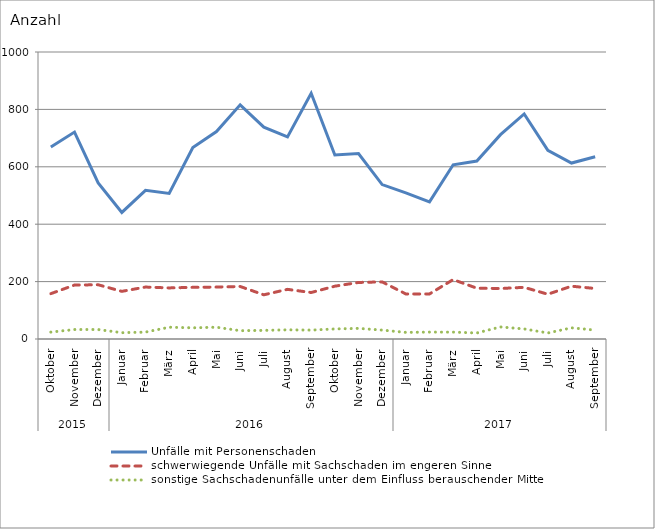
| Category | Unfälle mit Personenschaden | schwerwiegende Unfälle mit Sachschaden im engeren Sinne | sonstige Sachschadenunfälle unter dem Einfluss berauschender Mittel |
|---|---|---|---|
| 0 | 669 | 158 | 24 |
| 1 | 721 | 188 | 33 |
| 2 | 544 | 189 | 33 |
| 3 | 441 | 166 | 22 |
| 4 | 518 | 181 | 24 |
| 5 | 507 | 178 | 41 |
| 6 | 667 | 180 | 39 |
| 7 | 723 | 181 | 41 |
| 8 | 816 | 183 | 29 |
| 9 | 738 | 154 | 30 |
| 10 | 704 | 173 | 32 |
| 11 | 856 | 162 | 31 |
| 12 | 641 | 184 | 35 |
| 13 | 646 | 197 | 37 |
| 14 | 538 | 199 | 31 |
| 15 | 509 | 157 | 23 |
| 16 | 478 | 157 | 24 |
| 17 | 607 | 207 | 24 |
| 18 | 620 | 177 | 21 |
| 19 | 712 | 176 | 42 |
| 20 | 784 | 180 | 35 |
| 21 | 657 | 156 | 21 |
| 22 | 613 | 184 | 39 |
| 23 | 635 | 176 | 31 |